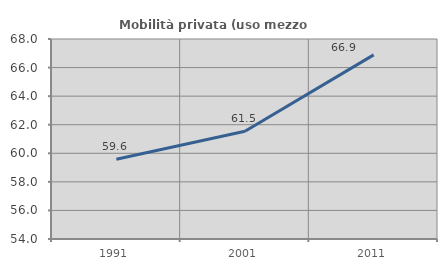
| Category | Mobilità privata (uso mezzo privato) |
|---|---|
| 1991.0 | 59.582 |
| 2001.0 | 61.538 |
| 2011.0 | 66.889 |